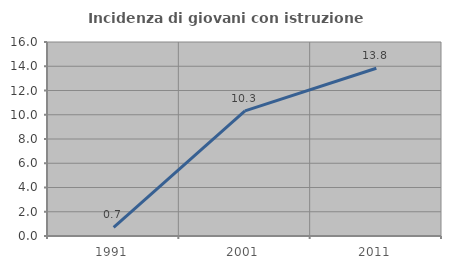
| Category | Incidenza di giovani con istruzione universitaria |
|---|---|
| 1991.0 | 0.714 |
| 2001.0 | 10.315 |
| 2011.0 | 13.832 |